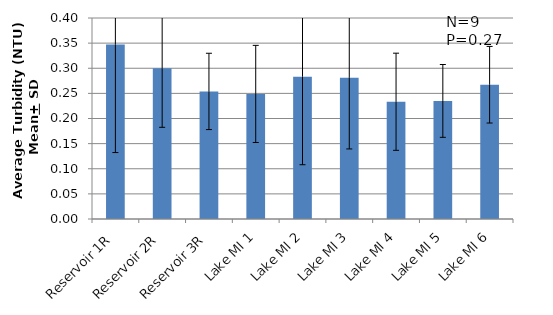
| Category | Series 0 |
|---|---|
| Reservoir 1R | 0.347 |
| Reservoir 2R | 0.3 |
| Reservoir 3R | 0.254 |
| Lake MI 1 | 0.249 |
| Lake MI 2 | 0.283 |
| Lake MI 3 | 0.281 |
| Lake MI 4 | 0.233 |
| Lake MI 5 | 0.235 |
| Lake MI 6 | 0.267 |